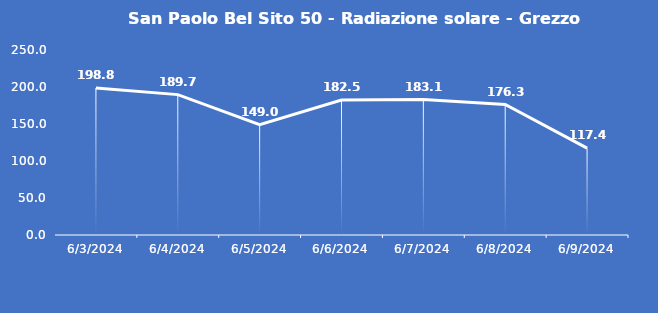
| Category | San Paolo Bel Sito 50 - Radiazione solare - Grezzo (W/m2) |
|---|---|
| 6/3/24 | 198.8 |
| 6/4/24 | 189.7 |
| 6/5/24 | 149 |
| 6/6/24 | 182.5 |
| 6/7/24 | 183.1 |
| 6/8/24 | 176.3 |
| 6/9/24 | 117.4 |